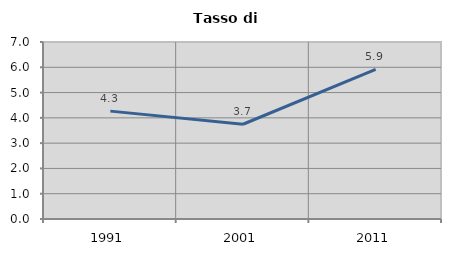
| Category | Tasso di disoccupazione   |
|---|---|
| 1991.0 | 4.266 |
| 2001.0 | 3.747 |
| 2011.0 | 5.92 |